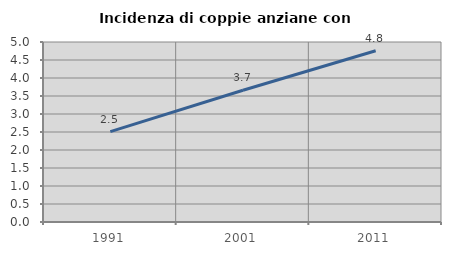
| Category | Incidenza di coppie anziane con figli |
|---|---|
| 1991.0 | 2.509 |
| 2001.0 | 3.66 |
| 2011.0 | 4.757 |